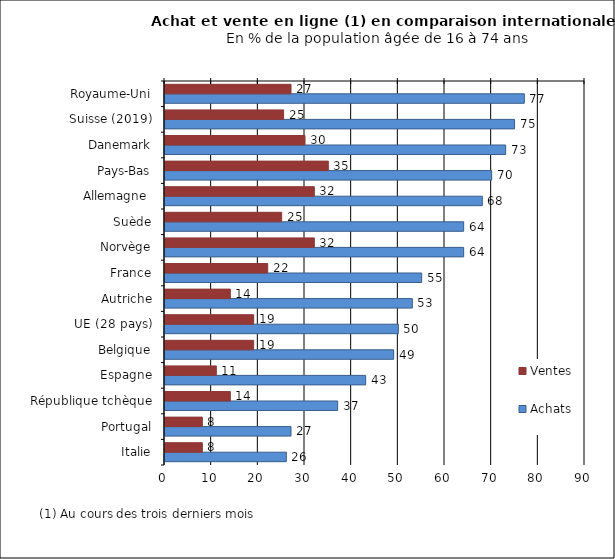
| Category | Achats | Ventes |
|---|---|---|
| Italie | 26 | 8 |
| Portugal | 27 | 8 |
| République tchèque | 37 | 14 |
| Espagne | 43 | 11 |
| Belgique | 49 | 19 |
| UE (28 pays) | 50 | 19 |
| Autriche | 53 | 14 |
| France | 55 | 22 |
| Norvège | 64 | 32 |
| Suède | 64 | 25 |
| Allemagne  | 68 | 32 |
| Pays-Bas | 70 | 35 |
| Danemark | 73 | 30 |
| Suisse (2019) | 74.905 | 25.417 |
| Royaume-Uni | 77 | 27 |